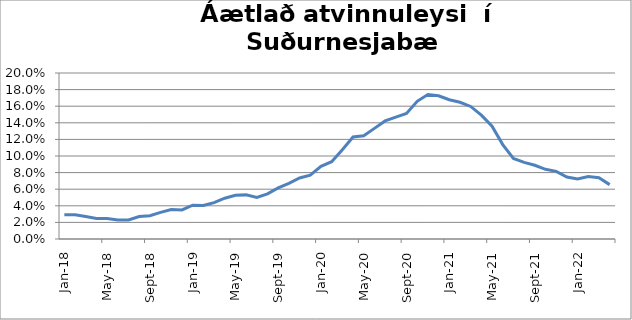
| Category | Series 0 |
|---|---|
| 2018-01-01 | 0.029 |
| 2018-02-01 | 0.029 |
| 2018-03-01 | 0.027 |
| 2018-04-01 | 0.025 |
| 2018-05-01 | 0.025 |
| 2018-06-01 | 0.023 |
| 2018-07-01 | 0.023 |
| 2018-08-01 | 0.027 |
| 2018-09-01 | 0.028 |
| 2018-10-01 | 0.032 |
| 2018-11-01 | 0.036 |
| 2018-12-01 | 0.035 |
| 2019-01-01 | 0.041 |
| 2019-02-01 | 0.04 |
| 2019-03-01 | 0.044 |
| 2019-04-01 | 0.049 |
| 2019-05-01 | 0.053 |
| 2019-06-01 | 0.053 |
| 2019-07-01 | 0.05 |
| 2019-08-01 | 0.054 |
| 2019-09-01 | 0.062 |
| 2019-10-01 | 0.067 |
| 2019-11-01 | 0.073 |
| 2019-12-01 | 0.077 |
| 2020-01-01 | 0.087 |
| 2020-02-01 | 0.093 |
| 2020-03-01 | 0.108 |
| 2020-04-01 | 0.123 |
| 2020-05-01 | 0.124 |
| 2020-06-01 | 0.133 |
| 2020-07-01 | 0.142 |
| 2020-08-01 | 0.147 |
| 2020-09-01 | 0.151 |
| 2020-10-01 | 0.166 |
| 2020-11-01 | 0.174 |
| 2020-12-01 | 0.173 |
| 2021-01-01 | 0.168 |
| 2021-02-01 | 0.165 |
| 2021-03-01 | 0.16 |
| 2021-04-01 | 0.149 |
| 2021-05-01 | 0.136 |
| 2021-06-01 | 0.114 |
| 2021-07-01 | 0.097 |
| 2021-08-01 | 0.092 |
| 2021-09-01 | 0.089 |
| 2021-10-01 | 0.084 |
| 2021-11-01 | 0.082 |
| 2021-12-01 | 0.075 |
| 2022-01-01 | 0.072 |
| 2022-02-01 | 0.075 |
| 2022-03-01 | 0.074 |
| 2022-04-01 | 0.066 |